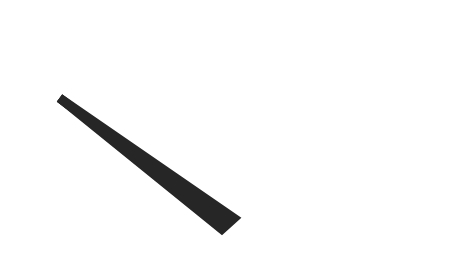
| Category | y |
|---|---|
| 13.062712611258377 | 33.699 |
| 51.3479684271445 | 1.477 |
| 48.6520315728555 | -1.477 |
| 13.062712611258377 | 33.699 |
| 50.0 | 0 |